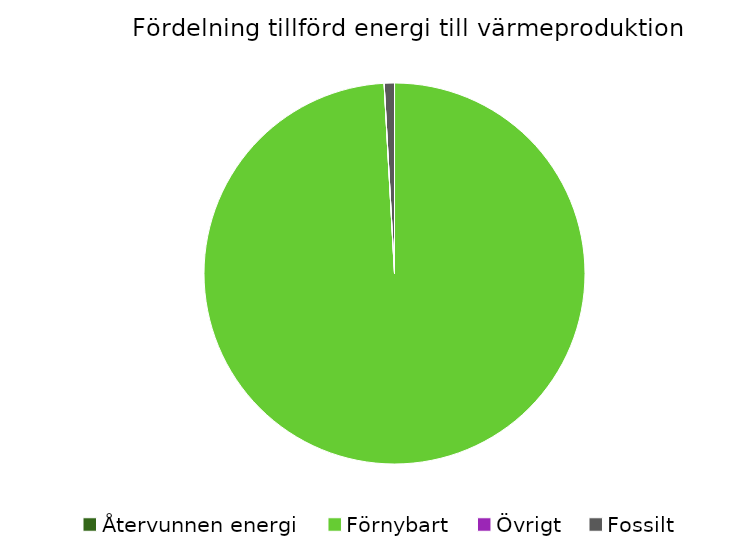
| Category | Fördelning värmeproduktion |
|---|---|
| Återvunnen energi | 0 |
| Förnybart | 0.991 |
| Övrigt | 0 |
| Fossilt | 0.009 |